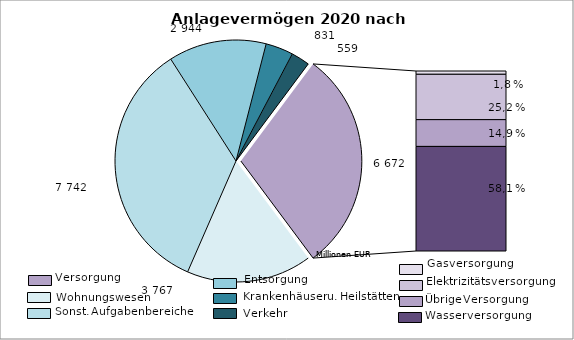
| Category | Series 0 |
|---|---|
| Wohnungsunternehmen | 3767 |
| sonstige Aufgabenbereiche | 7742 |
| Entsorgungsunternehmen | 2944 |
| Krankenhäuser | 831 |
| Verkehrsunternehmen | 559 |
| Gas | 122 |
| Elektrizität | 1681 |
| Kombinierte Unternehmen | 993 |
| Wasser | 3876 |